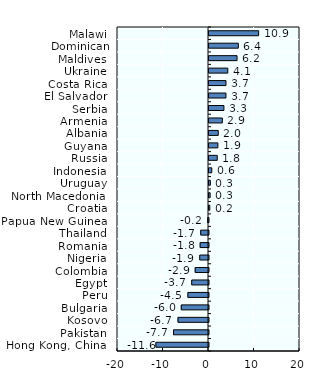
| Category | Pension funds |
|---|---|
| Malawi | 10.916 |
| Dominican Republic | 6.447 |
| Maldives | 6.162 |
| Ukraine | 4.134 |
| Costa Rica | 3.733 |
| El Salvador | 3.727 |
| Serbia | 3.281 |
| Armenia | 2.933 |
| Albania | 2.036 |
| Guyana | 1.949 |
| Russia | 1.814 |
| Indonesia | 0.614 |
| Uruguay | 0.298 |
| North Macedonia | 0.253 |
| Croatia | 0.174 |
| Papua New Guinea | -0.17 |
| Thailand | -1.708 |
| Romania | -1.834 |
| Nigeria | -1.926 |
| Colombia | -2.928 |
| Egypt | -3.685 |
| Peru | -4.531 |
| Bulgaria | -5.985 |
| Kosovo | -6.705 |
| Pakistan | -7.687 |
| Hong Kong, China | -11.561 |